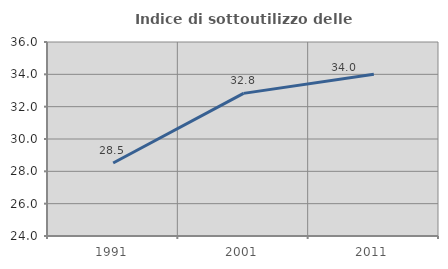
| Category | Indice di sottoutilizzo delle abitazioni  |
|---|---|
| 1991.0 | 28.515 |
| 2001.0 | 32.822 |
| 2011.0 | 34.005 |